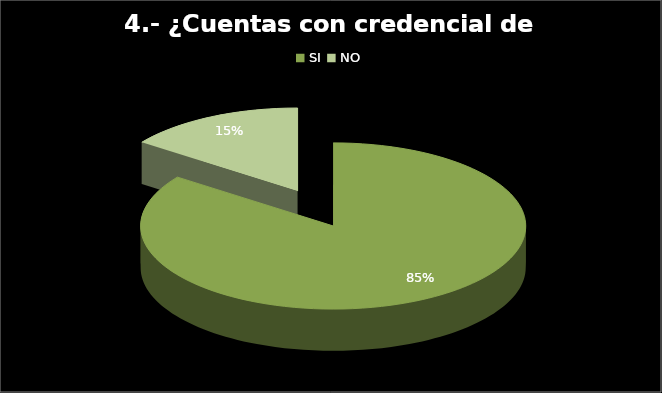
| Category | Series 0 |
|---|---|
| SI  | 68 |
| NO | 12 |